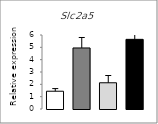
| Category | Series 0 |
|---|---|
| 0 | 1.441 |
| 1 | 4.949 |
| 2 | 2.127 |
| 3 | 5.648 |